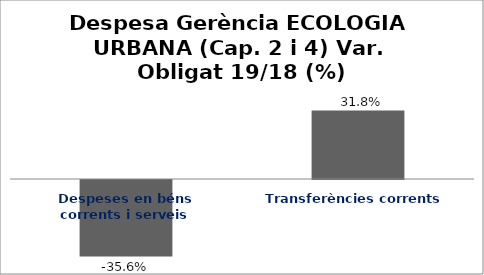
| Category | Series 0 |
|---|---|
| Despeses en béns corrents i serveis | -0.356 |
| Transferències corrents | 0.318 |